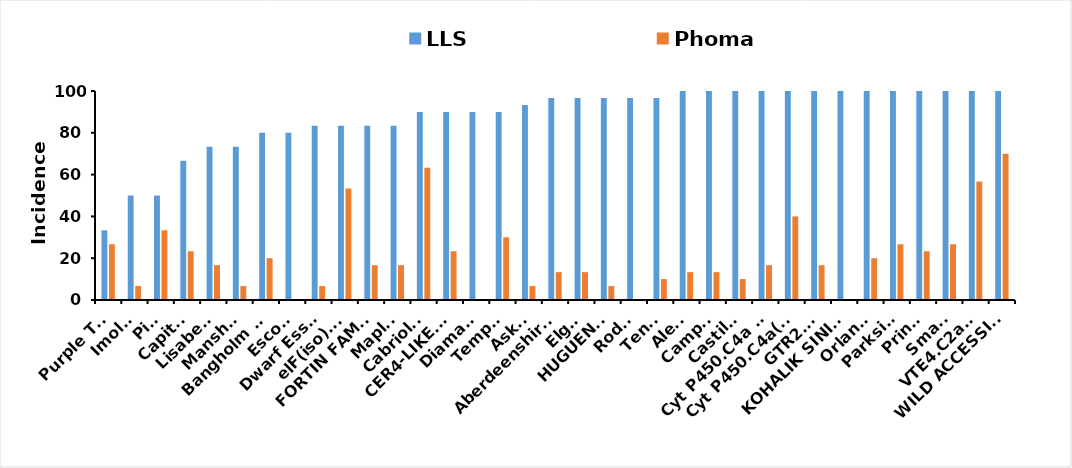
| Category | LLS  | Phoma  |
|---|---|---|
| Purple Top | 33.333 | 26.667 |
| Imola  | 50 | 6.667 |
| Pike | 50 | 33.333 |
| Capitol | 66.667 | 23.333 |
| Lisabeth | 73.333 | 16.667 |
| Mansholt | 73.333 | 6.667 |
| Bangholm PT | 80 | 20 |
| Escort | 80 | 0 |
| Dwarf Essex | 83.333 | 6.667 |
| elF(iso).C8 | 83.333 | 53.333 |
| FORTIN FAMILY | 83.333 | 16.667 |
| Maplus | 83.333 | 16.667 |
| Cabriolet | 90 | 63.333 |
| CER4-LIKE.A1  | 90 | 23.333 |
| Diamant | 90 | 0 |
| Temple | 90 | 30 |
| Askari | 93.333 | 6.667 |
| Aberdeenshire Prize | 96.667 | 13.333 |
| Elgar | 96.667 | 13.333 |
| HUGUENOT | 96.667 | 6.667 |
| Rodeo | 96.667 | 0 |
| Tenor | 96.667 | 10 |
| Alesi | 100 | 13.333 |
| Campari | 100 | 13.333 |
| Castille | 100 | 10 |
| Cyt P450.C4a (1708) | 100 | 16.667 |
| Cyt P450.C4a(1411) | 100 | 40 |
| GTR2.A6 | 100 | 16.667 |
| KOHALIK SININE | 100 | 0 |
| Orlando | 100 | 20 |
| Parkside | 100 | 26.667 |
| Prince | 100 | 23.333 |
| Smart | 100 | 26.667 |
| VTE4.C2a/b | 100 | 56.667 |
| WILD ACCESSION | 100 | 70 |